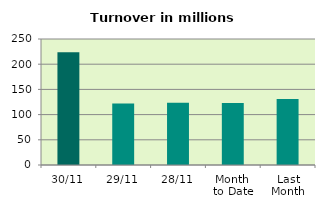
| Category | Series 0 |
|---|---|
| 30/11 | 223.482 |
| 29/11 | 122.062 |
| 28/11 | 123.376 |
| Month 
to Date | 122.873 |
| Last
Month | 131.017 |